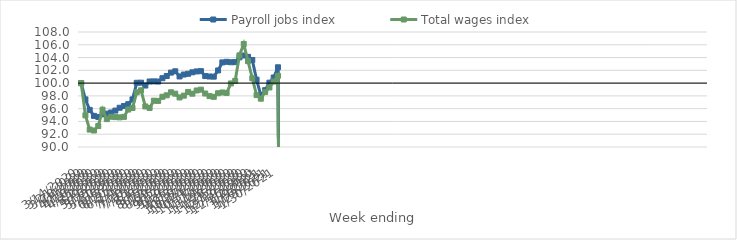
| Category | Payroll jobs index | Total wages index |
|---|---|---|
| 14/03/2020 | 100 | 100 |
| 21/03/2020 | 97.449 | 94.949 |
| 28/03/2020 | 95.808 | 92.725 |
| 04/04/2020 | 94.87 | 92.581 |
| 11/04/2020 | 94.708 | 93.28 |
| 18/04/2020 | 95.112 | 95.844 |
| 25/04/2020 | 95.225 | 94.362 |
| 02/05/2020 | 95.396 | 94.735 |
| 09/05/2020 | 95.701 | 94.681 |
| 16/05/2020 | 96.142 | 94.638 |
| 23/05/2020 | 96.423 | 94.719 |
| 30/05/2020 | 96.702 | 95.861 |
| 06/06/2020 | 97.448 | 96.103 |
| 13/06/2020 | 100.051 | 98.566 |
| 20/06/2020 | 100.066 | 98.879 |
| 27/06/2020 | 99.62 | 96.349 |
| 04/07/2020 | 100.252 | 96.116 |
| 11/07/2020 | 100.27 | 97.248 |
| 18/07/2020 | 100.245 | 97.213 |
| 25/07/2020 | 100.77 | 97.863 |
| 01/08/2020 | 101.108 | 98.09 |
| 08/08/2020 | 101.644 | 98.564 |
| 15/08/2020 | 101.849 | 98.346 |
| 22/08/2020 | 101.041 | 97.756 |
| 29/08/2020 | 101.343 | 98.036 |
| 05/09/2020 | 101.458 | 98.618 |
| 12/09/2020 | 101.69 | 98.346 |
| 19/09/2020 | 101.828 | 98.848 |
| 26/09/2020 | 101.872 | 98.977 |
| 03/10/2020 | 101.1 | 98.369 |
| 10/10/2020 | 101.037 | 97.962 |
| 17/10/2020 | 101.012 | 97.854 |
| 24/10/2020 | 101.982 | 98.417 |
| 31/10/2020 | 103.242 | 98.537 |
| 07/11/2020 | 103.333 | 98.46 |
| 14/11/2020 | 103.265 | 99.948 |
| 21/11/2020 | 103.281 | 100.357 |
| 28/11/2020 | 104.039 | 104.347 |
| 05/12/2020 | 104.322 | 106.122 |
| 12/12/2020 | 104.112 | 103.432 |
| 19/12/2020 | 103.623 | 100.764 |
| 26/12/2020 | 100.535 | 98.122 |
| 02/01/2021 | 98.09 | 97.558 |
| 09/01/2021 | 98.894 | 98.604 |
| 16/01/2021 | 100.065 | 99.318 |
| 23/01/2021 | 100.874 | 100.24 |
| 30/01/2021 | 102.477 | 101.144 |